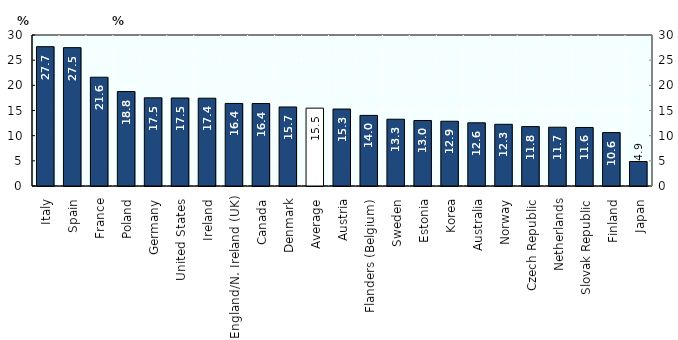
| Category | Series 0 |
|---|---|
| Italy  | 27.682 |
| Spain  | 27.491 |
| France  | 21.61 |
| Poland  | 18.769 |
| Germany  | 17.519 |
| United States  | 17.485 |
| Ireland  | 17.441 |
| England/N. Ireland (UK)  | 16.403 |
| Canada  | 16.383 |
| Denmark  | 15.7 |
| Average  | 15.47 |
| Austria  | 15.29 |
| Flanders (Belgium)  | 14.028 |
| Sweden  | 13.267 |
| Estonia  | 13.016 |
| Korea  | 12.864 |
| Australia  | 12.555 |
| Norway  | 12.259 |
| Czech Republic  | 11.797 |
| Netherlands  | 11.677 |
| Slovak Republic  | 11.627 |
| Finland  | 10.61 |
| Japan  | 4.868 |